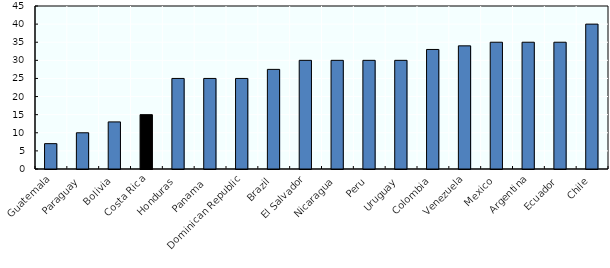
| Category | 2013 |
|---|---|
| Guatemala | 7 |
| Paraguay | 10 |
| Bolivia | 13 |
| Costa Rica | 15 |
| Honduras | 25 |
| Panama  | 25 |
| Dominican Republic | 25 |
| Brazil | 27.5 |
| El Salvador | 30 |
| Nicaragua  | 30 |
| Peru | 30 |
| Uruguay | 30 |
| Colombia | 33 |
| Venezuela | 34 |
| Mexico | 35 |
| Argentina | 35 |
| Ecuador | 35 |
| Chile | 40 |